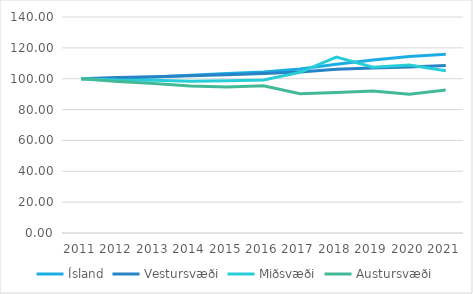
| Category |  Ísland  |  Vestursvæði  |  Miðsvæði  |  Austursvæði  |
|---|---|---|---|---|
| 2011.0 | 100 | 100 | 100 | 100 |
| 2012.0 | 100.353 | 100.753 | 99.22 | 98.228 |
| 2013.0 | 101.069 | 101.273 | 99.059 | 96.962 |
| 2014.0 | 102.267 | 101.896 | 98.359 | 95.274 |
| 2015.0 | 103.344 | 102.561 | 98.682 | 94.684 |
| 2016.0 | 104.42 | 103.34 | 99.112 | 95.359 |
| 2017.0 | 106.248 | 104.286 | 104.115 | 90.295 |
| 2018.0 | 109.42 | 106.13 | 114.067 | 91.055 |
| 2019.0 | 112.102 | 106.935 | 107.504 | 92.068 |
| 2020.0 | 114.345 | 107.58 | 108.876 | 89.873 |
| 2021.0 | 115.808 | 108.546 | 105.137 | 92.658 |